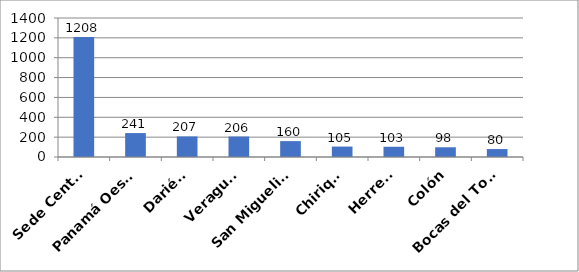
| Category | Series 0 |
|---|---|
| Sede Central | 1208 |
| Panamá Oeste  | 241 |
| Darién  | 207 |
| Veraguas | 206 |
| San Miguelito  | 160 |
| Chiriquí | 105 |
| Herrera | 103 |
| Colón | 98 |
| Bocas del Toro  | 80 |